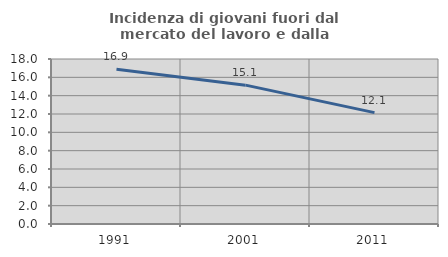
| Category | Incidenza di giovani fuori dal mercato del lavoro e dalla formazione  |
|---|---|
| 1991.0 | 16.893 |
| 2001.0 | 15.147 |
| 2011.0 | 12.15 |